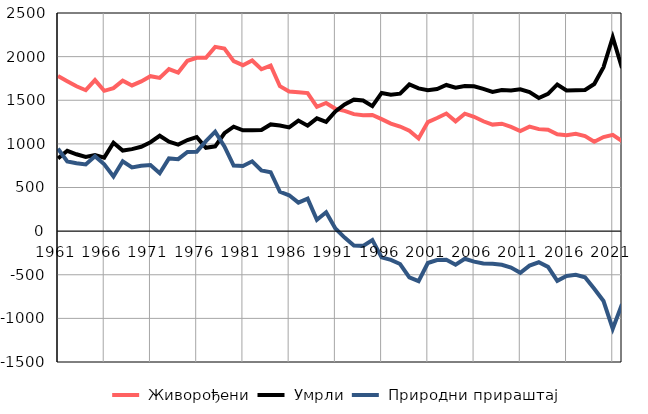
| Category |  Живорођени |  Умрли |  Природни прираштај |
|---|---|---|---|
| 1961.0 | 1779 | 833 | 946 |
| 1962.0 | 1719 | 921 | 798 |
| 1963.0 | 1660 | 881 | 779 |
| 1964.0 | 1615 | 850 | 765 |
| 1965.0 | 1731 | 873 | 858 |
| 1966.0 | 1608 | 842 | 766 |
| 1967.0 | 1639 | 1013 | 626 |
| 1968.0 | 1724 | 923 | 801 |
| 1969.0 | 1670 | 940 | 730 |
| 1970.0 | 1716 | 967 | 749 |
| 1971.0 | 1776 | 1019 | 757 |
| 1972.0 | 1756 | 1093 | 663 |
| 1973.0 | 1858 | 1025 | 833 |
| 1974.0 | 1817 | 992 | 825 |
| 1975.0 | 1952 | 1044 | 908 |
| 1976.0 | 1987 | 1078 | 909 |
| 1977.0 | 1987 | 955 | 1032 |
| 1978.0 | 2112 | 972 | 1140 |
| 1979.0 | 2093 | 1122 | 971 |
| 1980.0 | 1949 | 1197 | 752 |
| 1981.0 | 1902 | 1155 | 747 |
| 1982.0 | 1956 | 1156 | 800 |
| 1983.0 | 1855 | 1160 | 695 |
| 1984.0 | 1898 | 1223 | 675 |
| 1985.0 | 1661 | 1210 | 451 |
| 1986.0 | 1600 | 1189 | 411 |
| 1987.0 | 1593 | 1267 | 326 |
| 1988.0 | 1582 | 1209 | 373 |
| 1989.0 | 1424 | 1293 | 131 |
| 1990.0 | 1469 | 1253 | 216 |
| 1991.0 | 1402 | 1372 | 30 |
| 1992.0 | 1379 | 1453 | -74 |
| 1993.0 | 1341 | 1507 | -166 |
| 1994.0 | 1329 | 1498 | -169 |
| 1995.0 | 1331 | 1433 | -102 |
| 1996.0 | 1283 | 1584 | -301 |
| 1997.0 | 1233 | 1563 | -330 |
| 1998.0 | 1199 | 1576 | -377 |
| 1999.0 | 1150 | 1681 | -531 |
| 2000.0 | 1062 | 1636 | -574 |
| 2001.0 | 1250 | 1615 | -365 |
| 2002.0 | 1297 | 1629 | -332 |
| 2003.0 | 1348 | 1675 | -327 |
| 2004.0 | 1259 | 1644 | -385 |
| 2005.0 | 1346 | 1663 | -317 |
| 2006.0 | 1311 | 1661 | -350 |
| 2007.0 | 1259 | 1631 | -372 |
| 2008.0 | 1221 | 1596 | -375 |
| 2009.0 | 1231 | 1617 | -386 |
| 2010.0 | 1195 | 1612 | -417 |
| 2011.0 | 1147 | 1625 | -478 |
| 2012.0 | 1198 | 1593 | -395 |
| 2013.0 | 1169 | 1526 | -357 |
| 2014.0 | 1163 | 1573 | -410 |
| 2015.0 | 1111 | 1681 | -570 |
| 2016.0 | 1099 | 1613 | -514 |
| 2017.0 | 1115 | 1616 | -501 |
| 2018.0 | 1089 | 1618 | -529 |
| 2019.0 | 1025 | 1686 | -661 |
| 2020.0 | 1078 | 1879 | -801 |
| 2021.0 | 1103 | 2222 | -1119 |
| 2022.0 | 1032 | 1870 | -838 |